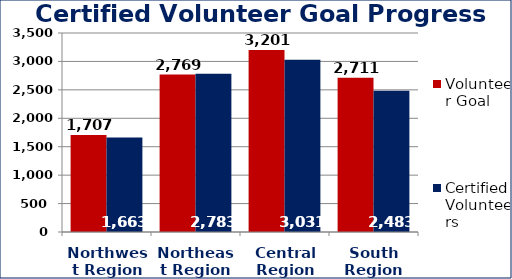
| Category | Volunteer Goal  | Certified Volunteers  |
|---|---|---|
| Northwest Region | 1707 | 1663 |
| Northeast Region | 2769 | 2783 |
| Central Region | 3201 | 3031 |
| South Region | 2711 | 2483 |